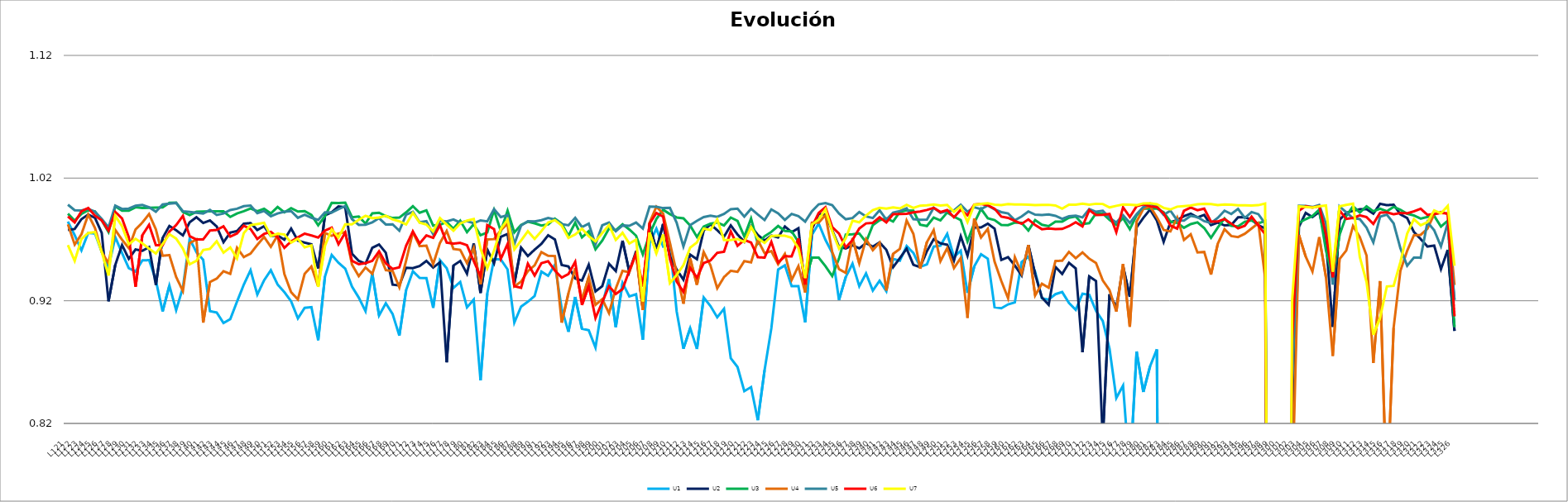
| Category | U1 | U2 | U3 | U4 | U5 | U6 | U7 |
|---|---|---|---|---|---|---|---|
| L121 | 0.984 | 0.978 | 0.991 | 0.982 | 0.998 | 0.989 | 0.965 |
| L122 | 0.973 | 0.978 | 0.985 | 0.966 | 0.994 | 0.984 | 0.952 |
| L123 | 0.961 | 0.987 | 0.991 | 0.974 | 0.994 | 0.993 | 0.97 |
| L124 | 0.975 | 0.99 | 0.994 | 0.99 | 0.995 | 0.996 | 0.975 |
| L125 | 0.975 | 0.988 | 0.993 | 0.979 | 0.993 | 0.989 | 0.976 |
| L126 | 0.96 | 0.975 | 0.985 | 0.96 | 0.987 | 0.986 | 0.96 |
| L127 | 0.947 | 0.92 | 0.976 | 0.951 | 0.98 | 0.977 | 0.941 |
| L128 | 0.972 | 0.949 | 0.997 | 0.978 | 0.998 | 0.992 | 0.989 |
| L129 | 0.959 | 0.965 | 0.993 | 0.97 | 0.995 | 0.987 | 0.981 |
| L130 | 0.947 | 0.954 | 0.993 | 0.963 | 0.995 | 0.972 | 0.966 |
| L131 | 0.944 | 0.962 | 0.996 | 0.978 | 0.997 | 0.931 | 0.97 |
| L132 | 0.953 | 0.961 | 0.996 | 0.984 | 0.998 | 0.973 | 0.967 |
| L133 | 0.953 | 0.964 | 0.996 | 0.991 | 0.996 | 0.982 | 0.962 |
| L134 | 0.937 | 0.933 | 0.996 | 0.978 | 0.993 | 0.965 | 0.959 |
| L135 | 0.911 | 0.971 | 0.996 | 0.957 | 0.998 | 0.965 | 0.966 |
| L136 | 0.932 | 0.981 | 1 | 0.957 | 0.999 | 0.976 | 0.974 |
| L137 | 0.912 | 0.977 | 1 | 0.939 | 1 | 0.982 | 0.971 |
| L138 | 0.931 | 0.973 | 0.992 | 0.928 | 0.993 | 0.989 | 0.963 |
| L139 | 0.97 | 0.984 | 0.99 | 0.967 | 0.992 | 0.973 | 0.95 |
| L140 | 0.96 | 0.988 | 0.993 | 0.97 | 0.992 | 0.97 | 0.953 |
| L141 | 0.953 | 0.983 | 0.993 | 0.902 | 0.991 | 0.97 | 0.961 |
| L142 | 0.912 | 0.985 | 0.993 | 0.935 | 0.994 | 0.977 | 0.962 |
| L143 | 0.91 | 0.981 | 0.993 | 0.938 | 0.99 | 0.978 | 0.969 |
| L144 | 0.902 | 0.968 | 0.993 | 0.944 | 0.991 | 0.981 | 0.959 |
| L145 | 0.905 | 0.976 | 0.988 | 0.942 | 0.994 | 0.972 | 0.963 |
| L146 | 0.919 | 0.977 | 0.991 | 0.963 | 0.995 | 0.975 | 0.954 |
| L147 | 0.933 | 0.983 | 0.993 | 0.956 | 0.997 | 0.981 | 0.975 |
| L148 | 0.945 | 0.983 | 0.995 | 0.958 | 0.998 | 0.978 | 0.982 |
| L149 | 0.925 | 0.978 | 0.993 | 0.966 | 0.991 | 0.97 | 0.983 |
| L150 | 0.937 | 0.981 | 0.995 | 0.972 | 0.993 | 0.975 | 0.984 |
| L151 | 0.945 | 0.973 | 0.991 | 0.964 | 0.989 | 0.976 | 0.973 |
| L152 | 0.933 | 0.973 | 0.996 | 0.973 | 0.991 | 0.972 | 0.975 |
| L153 | 0.927 | 0.97 | 0.992 | 0.942 | 0.993 | 0.963 | 0.974 |
| L154 | 0.92 | 0.979 | 0.996 | 0.927 | 0.993 | 0.968 | 0.967 |
| L155 | 0.906 | 0.969 | 0.993 | 0.921 | 0.988 | 0.972 | 0.97 |
| L156 | 0.914 | 0.967 | 0.993 | 0.942 | 0.99 | 0.975 | 0.964 |
| L157 | 0.915 | 0.966 | 0.99 | 0.948 | 0.988 | 0.973 | 0.965 |
| L158 | 0.888 | 0.946 | 0.982 | 0.932 | 0.986 | 0.972 | 0.931 |
| L159 | 0.94 | 0.99 | 0.989 | 0.975 | 0.992 | 0.977 | 0.965 |
| L160 | 0.957 | 0.992 | 1 | 0.973 | 0.992 | 0.98 | 0.978 |
| L161 | 0.951 | 0.997 | 1 | 0.975 | 0.995 | 0.966 | 0.972 |
| L162 | 0.946 | 0.996 | 1 | 0.976 | 0.997 | 0.976 | 0.982 |
| L163 | 0.932 | 0.958 | 0.988 | 0.95 | 0.987 | 0.953 | 0.982 |
| L164 | 0.923 | 0.952 | 0.989 | 0.94 | 0.982 | 0.95 | 0.986 |
| L165 | 0.911 | 0.95 | 0.983 | 0.947 | 0.982 | 0.951 | 0.989 |
| L166 | 0.942 | 0.963 | 0.991 | 0.942 | 0.984 | 0.953 | 0.987 |
| L167 | 0.908 | 0.966 | 0.992 | 0.958 | 0.987 | 0.96 | 0.988 |
| L168 | 0.918 | 0.959 | 0.989 | 0.945 | 0.982 | 0.951 | 0.989 |
| L169 | 0.909 | 0.933 | 0.987 | 0.944 | 0.982 | 0.946 | 0.986 |
| L170 | 0.892 | 0.932 | 0.988 | 0.931 | 0.977 | 0.947 | 0.985 |
| L171 | 0.929 | 0.947 | 0.992 | 0.953 | 0.99 | 0.965 | 0.982 |
| L172 | 0.944 | 0.947 | 0.997 | 0.976 | 0.993 | 0.977 | 0.992 |
| L173 | 0.939 | 0.948 | 0.992 | 0.965 | 0.984 | 0.967 | 0.984 |
| L174 | 0.938 | 0.952 | 0.994 | 0.965 | 0.985 | 0.973 | 0.982 |
| L175 | 0.914 | 0.947 | 0.981 | 0.95 | 0.974 | 0.971 | 0.977 |
| L176 | 0.953 | 0.951 | 0.982 | 0.967 | 0.985 | 0.982 | 0.987 |
| L177 | 0.947 | 0.87 | 0.984 | 0.977 | 0.985 | 0.967 | 0.982 |
| L178 | 0.931 | 0.949 | 0.979 | 0.962 | 0.986 | 0.967 | 0.977 |
| L179 | 0.935 | 0.952 | 0.985 | 0.961 | 0.984 | 0.967 | 0.983 |
| L180 | 0.915 | 0.942 | 0.976 | 0.951 | 0.985 | 0.965 | 0.985 |
| L181 | 0.921 | 0.967 | 0.982 | 0.963 | 0.983 | 0.952 | 0.987 |
| L182 | 0.855 | 0.926 | 0.973 | 0.933 | 0.986 | 0.94 | 0.963 |
| L183 | 0.926 | 0.962 | 0.976 | 0.97 | 0.985 | 0.982 | 0.946 |
| L184 | 0.954 | 0.951 | 0.994 | 0.97 | 0.995 | 0.978 | 0.961 |
| L185 | 0.954 | 0.972 | 0.977 | 0.978 | 0.988 | 0.954 | 0.979 |
| L186 | 0.946 | 0.974 | 0.993 | 0.983 | 0.99 | 0.966 | 0.986 |
| L187 | 0.902 | 0.934 | 0.976 | 0.932 | 0.966 | 0.932 | 0.962 |
| L188 | 0.915 | 0.963 | 0.982 | 0.936 | 0.981 | 0.931 | 0.969 |
| L189 | 0.919 | 0.956 | 0.984 | 0.944 | 0.985 | 0.95 | 0.977 |
| L190 | 0.924 | 0.962 | 0.983 | 0.949 | 0.985 | 0.941 | 0.97 |
| L191 | 0.944 | 0.966 | 0.981 | 0.96 | 0.986 | 0.951 | 0.977 |
| L192 | 0.94 | 0.973 | 0.982 | 0.957 | 0.987 | 0.952 | 0.984 |
| L193 | 0.949 | 0.97 | 0.987 | 0.956 | 0.986 | 0.945 | 0.986 |
| L194 | 0.914 | 0.949 | 0.983 | 0.902 | 0.983 | 0.939 | 0.981 |
| L195 | 0.895 | 0.948 | 0.973 | 0.926 | 0.982 | 0.942 | 0.971 |
| L196 | 0.923 | 0.938 | 0.984 | 0.947 | 0.988 | 0.952 | 0.974 |
| L197 | 0.897 | 0.936 | 0.972 | 0.921 | 0.98 | 0.917 | 0.979 |
| L198 | 0.896 | 0.949 | 0.977 | 0.939 | 0.983 | 0.932 | 0.973 |
| L199 | 0.882 | 0.928 | 0.962 | 0.917 | 0.966 | 0.906 | 0.968 |
| L200 | 0.917 | 0.932 | 0.969 | 0.921 | 0.981 | 0.919 | 0.975 |
| L201 | 0.938 | 0.95 | 0.979 | 0.91 | 0.984 | 0.932 | 0.982 |
| L202 | 0.899 | 0.944 | 0.977 | 0.93 | 0.977 | 0.926 | 0.97 |
| L203 | 0.934 | 0.969 | 0.982 | 0.944 | 0.981 | 0.93 | 0.975 |
| L204 | 0.923 | 0.944 | 0.978 | 0.943 | 0.981 | 0.944 | 0.967 |
| L205 | 0.925 | 0.96 | 0.973 | 0.958 | 0.984 | 0.959 | 0.97 |
| L206 | 0.888 | 0.913 | 0.958 | 0.912 | 0.979 | 0.932 | 0.919 |
| L207 | 0.967 | 0.982 | 0.974 | 0.984 | 0.997 | 0.983 | 0.976 |
| L208 | 0.979 | 0.961 | 0.987 | 0.997 | 0.997 | 0.992 | 0.959 |
| L209 | 0.964 | 0.983 | 0.994 | 0.991 | 0.996 | 0.989 | 0.974 |
| L210 | 0.967 | 0.956 | 0.991 | 0.967 | 0.996 | 0.954 | 0.934 |
| L211 | 0.911 | 0.945 | 0.988 | 0.943 | 0.984 | 0.936 | 0.941 |
| L212 | 0.881 | 0.937 | 0.987 | 0.918 | 0.964 | 0.927 | 0.949 |
| L213 | 0.898 | 0.958 | 0.981 | 0.954 | 0.982 | 0.947 | 0.963 |
| L214 | 0.881 | 0.954 | 0.972 | 0.933 | 0.985 | 0.939 | 0.968 |
| L215 | 0.923 | 0.977 | 0.981 | 0.96 | 0.988 | 0.951 | 0.979 |
| L216 | 0.916 | 0.982 | 0.983 | 0.949 | 0.989 | 0.953 | 0.978 |
| L217 | 0.907 | 0.978 | 0.984 | 0.93 | 0.988 | 0.959 | 0.986 |
| L218 | 0.913 | 0.972 | 0.981 | 0.939 | 0.991 | 0.96 | 0.969 |
| L219 | 0.873 | 0.981 | 0.988 | 0.944 | 0.995 | 0.977 | 0.97 |
| L220 | 0.866 | 0.974 | 0.985 | 0.944 | 0.995 | 0.965 | 0.97 |
| L221 | 0.846 | 0.968 | 0.972 | 0.952 | 0.989 | 0.97 | 0.968 |
| L222 | 0.85 | 0.981 | 0.987 | 0.951 | 0.995 | 0.967 | 0.98 |
| L223 | 0.823 | 0.974 | 0.967 | 0.969 | 0.99 | 0.955 | 0.971 |
| L224 | 0.863 | 0.969 | 0.973 | 0.959 | 0.986 | 0.955 | 0.967 |
| L225 | 0.898 | 0.973 | 0.976 | 0.96 | 0.994 | 0.968 | 0.973 |
| L226 | 0.945 | 0.972 | 0.981 | 0.95 | 0.991 | 0.951 | 0.973 |
| L227 | 0.949 | 0.981 | 0.977 | 0.958 | 0.986 | 0.956 | 0.973 |
| L228 | 0.932 | 0.976 | 0.977 | 0.937 | 0.991 | 0.956 | 0.971 |
| L229 | 0.932 | 0.979 | 0.968 | 0.948 | 0.989 | 0.971 | 0.963 |
| L230 | 0.902 | 0.929 | 0.937 | 0.927 | 0.985 | 0.933 | 0.938 |
| L231 | 0.974 | 0.978 | 0.955 | 0.984 | 0.993 | 0.98 | 0.982 |
| L232 | 0.983 | 0.991 | 0.955 | 0.984 | 0.999 | 0.992 | 0.986 |
| L233 | 0.97 | 0.99 | 0.948 | 0.99 | 1 | 0.996 | 0.995 |
| L234 | 0.959 | 0.977 | 0.94 | 0.96 | 0.998 | 0.98 | 0.977 |
| L235 | 0.921 | 0.964 | 0.954 | 0.946 | 0.991 | 0.975 | 0.963 |
| L236 | 0.939 | 0.963 | 0.974 | 0.943 | 0.986 | 0.963 | 0.971 |
| L237 | 0.95 | 0.965 | 0.974 | 0.971 | 0.987 | 0.97 | 0.985 |
| L238 | 0.932 | 0.963 | 0.975 | 0.951 | 0.992 | 0.979 | 0.984 |
| L239 | 0.942 | 0.967 | 0.968 | 0.97 | 0.989 | 0.983 | 0.989 |
| L240 | 0.928 | 0.964 | 0.982 | 0.961 | 0.987 | 0.984 | 0.994 |
| L241 | 0.936 | 0.968 | 0.986 | 0.967 | 0.994 | 0.988 | 0.996 |
| L242 | 0.928 | 0.962 | 0.987 | 0.928 | 0.986 | 0.984 | 0.995 |
| L243 | 0.954 | 0.947 | 0.985 | 0.958 | 0.992 | 0.991 | 0.996 |
| L244 | 0.953 | 0.955 | 0.992 | 0.962 | 0.993 | 0.991 | 0.995 |
| L245 | 0.965 | 0.962 | 0.994 | 0.985 | 0.995 | 0.991 | 0.998 |
| L246 | 0.959 | 0.949 | 0.993 | 0.974 | 0.987 | 0.992 | 0.996 |
| L247 | 0.948 | 0.947 | 0.982 | 0.946 | 0.986 | 0.993 | 0.998 |
| L248 | 0.95 | 0.96 | 0.981 | 0.968 | 0.986 | 0.994 | 0.998 |
| L249 | 0.964 | 0.97 | 0.988 | 0.978 | 0.996 | 0.996 | 0.998 |
| L250 | 0.965 | 0.967 | 0.985 | 0.952 | 0.992 | 0.992 | 0.998 |
| L251 | 0.975 | 0.966 | 0.992 | 0.963 | 0.993 | 0.994 | 0.998 |
| L252 | 0.956 | 0.953 | 0.989 | 0.947 | 0.994 | 0.988 | 0.992 |
| L253 | 0.961 | 0.973 | 0.986 | 0.955 | 0.998 | 0.994 | 0.997 |
| L254 | 0.926 | 0.957 | 0.968 | 0.906 | 0.993 | 0.99 | 0.984 |
| L255 | 0.948 | 0.98 | 0.983 | 0.987 | 0.996 | 0.998 | 0.998 |
| L256 | 0.958 | 0.98 | 0.995 | 0.972 | 0.995 | 0.999 | 0.999 |
| L257 | 0.954 | 0.983 | 0.987 | 0.979 | 0.998 | 0.998 | 1 |
| L258 | 0.915 | 0.979 | 0.986 | 0.952 | 0.994 | 0.995 | 0.998 |
| L259 | 0.914 | 0.953 | 0.982 | 0.936 | 0.992 | 0.989 | 0.998 |
| L260 | 0.917 | 0.956 | 0.982 | 0.922 | 0.991 | 0.988 | 0.999 |
| L261 | 0.919 | 0.949 | 0.984 | 0.956 | 0.986 | 0.985 | 0.998 |
| L262 | 0.952 | 0.941 | 0.983 | 0.942 | 0.989 | 0.983 | 0.999 |
| L263 | 0.956 | 0.965 | 0.977 | 0.965 | 0.993 | 0.986 | 0.998 |
| L264 | 0.944 | 0.942 | 0.986 | 0.924 | 0.99 | 0.982 | 0.998 |
| L265 | 0.922 | 0.923 | 0.982 | 0.934 | 0.99 | 0.978 | 0.998 |
| L266 | 0.921 | 0.917 | 0.981 | 0.931 | 0.99 | 0.979 | 0.998 |
| L267 | 0.925 | 0.948 | 0.984 | 0.952 | 0.989 | 0.978 | 0.998 |
| L268 | 0.927 | 0.942 | 0.985 | 0.953 | 0.987 | 0.979 | 0.995 |
| L269 | 0.918 | 0.951 | 0.988 | 0.96 | 0.989 | 0.981 | 0.998 |
| L270 | 0.913 | 0.946 | 0.989 | 0.955 | 0.989 | 0.984 | 0.998 |
| L271 | 0.926 | 0.878 | 0.983 | 0.959 | 0.988 | 0.981 | 0.999 |
| L272 | 0.925 | 0.94 | 0.983 | 0.954 | 0.995 | 0.994 | 0.998 |
| L273 | 0.912 | 0.936 | 0.991 | 0.951 | 0.993 | 0.99 | 0.999 |
| L274 | 0.903 | 0.807 | 0.991 | 0.937 | 0.993 | 0.99 | 0.999 |
| L275 | 0.881 | 0.925 | 0.986 | 0.929 | 0.988 | 0.991 | 0.996 |
| L276 | 0.841 | 0.914 | 0.982 | 0.911 | 0.984 | 0.976 | 0.997 |
| L277 | 0.851 | 0.948 | 0.987 | 0.95 | 0.99 | 0.996 | 0.998 |
| L278 | 0.778 | 0.923 | 0.978 | 0.899 | 0.983 | 0.988 | 0.998 |
| L279 | 0.879 | 0.98 | 0.99 | 0.985 | 0.991 | 0.997 | 0.998 |
| L280 | 0.846 | 0.988 | 0.995 | 0.995 | 0.996 | 0.999 | 0.999 |
| L281 | 0.867 | 0.994 | 0.995 | 0.997 | 0.999 | 0.997 | 0.999 |
| L282 | 0.88 | 0.985 | 0.995 | 0.988 | 0.997 | 0.996 | 0.999 |
| L283 | 0 | 0.968 | 0.992 | 0.978 | 0.99 | 0.991 | 0.996 |
| L284 | 0 | 0.984 | 0.985 | 0.976 | 0.993 | 0.981 | 0.994 |
| L285 | 0 | 0.986 | 0.984 | 0.988 | 0.986 | 0.979 | 0.997 |
| L286 | 0 | 0.989 | 0.98 | 0.97 | 0.985 | 0.993 | 0.997 |
| L287 | 0 | 0.991 | 0.982 | 0.974 | 0.989 | 0.996 | 0.998 |
| L288 | 0 | 0.988 | 0.984 | 0.959 | 0.988 | 0.994 | 0.999 |
| L289 | 0 | 0.99 | 0.979 | 0.96 | 0.985 | 0.995 | 0.999 |
| L290 | 0 | 0.982 | 0.971 | 0.941 | 0.983 | 0.985 | 0.999 |
| L291 | 0 | 0.984 | 0.98 | 0.966 | 0.988 | 0.985 | 0.998 |
| L292 | 0 | 0.981 | 0.987 | 0.978 | 0.993 | 0.987 | 0.998 |
| L293 | 0 | 0.982 | 0.981 | 0.973 | 0.991 | 0.983 | 0.998 |
| L294 | 0 | 0.988 | 0.981 | 0.972 | 0.995 | 0.979 | 0.998 |
| L295 | 0 | 0.988 | 0.984 | 0.975 | 0.988 | 0.981 | 0.998 |
| L296 | 0 | 0.986 | 0.985 | 0.979 | 0.992 | 0.988 | 0.998 |
| L297 | 0 | 0.982 | 0.983 | 0.983 | 0.991 | 0.981 | 0.998 |
| L298 | 0 | 0.979 | 0.985 | 0.939 | 0.983 | 0.974 | 0.999 |
| L299 | 0 | 0 | 0 | 0 | 0 | 0 | 0 |
| L300 | 0 | 0 | 0 | 0 | 0 | 0 | 0 |
| L301 | 0 | 0 | 0 | 0 | 0 | 0 | 0 |
| L302 | 0 | 0.787 | 0.862 | 0.76 | 0.856 | 0.887 | 0.921 |
| L303 | 0 | 0.98 | 0.983 | 0.974 | 0.997 | 0.993 | 0.997 |
| L304 | 0 | 0.992 | 0.986 | 0.956 | 0.997 | 0.997 | 0.997 |
| L305 | 0 | 0.988 | 0.989 | 0.944 | 0.996 | 0.996 | 0.996 |
| L306 | 0 | 0.992 | 0.994 | 0.972 | 0.998 | 0.997 | 0.997 |
| L307 | 0 | 0.969 | 0.961 | 0.939 | 0.983 | 0.974 | 0.998 |
| L308 | 0 | 0.899 | 0.938 | 0.875 | 0.933 | 0.939 | 0.944 |
| L309 | 0 | 0.986 | 0.974 | 0.954 | 0.997 | 0.994 | 0.997 |
| L310 | 0 | 0.992 | 0.989 | 0.961 | 0.992 | 0.987 | 0.998 |
| L311 | 0 | 0.993 | 0.997 | 0.981 | 0.987 | 0.988 | 0.999 |
| L312 | 0 | 0.995 | 0.992 | 0.972 | 0.987 | 0.99 | 0.956 |
| L313 | 0 | 0.995 | 0.997 | 0.957 | 0.98 | 0.988 | 0.935 |
| L314 | 0 | 0.991 | 0.993 | 0.869 | 0.968 | 0.983 | 0.892 |
| L315 | 0 | 0.999 | 0.995 | 0.936 | 0.989 | 0.992 | 0.906 |
| L316 | 0 | 0.998 | 0.993 | 0.756 | 0.99 | 0.992 | 0.932 |
| L317 | 0 | 0.998 | 0.997 | 0.898 | 0.983 | 0.991 | 0.932 |
| L318 | 0 | 0.99 | 0.994 | 0.944 | 0.963 | 0.992 | 0.952 |
| L319 | 0 | 0.987 | 0.991 | 0.961 | 0.949 | 0.991 | 0.975 |
| L320 | 0 | 0.976 | 0.99 | 0.973 | 0.955 | 0.993 | 0.986 |
| L321 | 0 | 0.97 | 0.987 | 0.974 | 0.955 | 0.995 | 0.982 |
| L322 | 0 | 0.964 | 0.988 | 0.979 | 0.984 | 0.99 | 0.984 |
| L323 | 0 | 0.965 | 0.989 | 0.99 | 0.977 | 0.991 | 0.994 |
| L324 | 0 | 0.946 | 0.98 | 0.992 | 0.964 | 0.992 | 0.991 |
| L325 | 0 | 0.962 | 0.985 | 0.991 | 0.983 | 0.991 | 0.997 |
| L326 | 0 | 0.895 | 0.898 | 0.933 | 0.921 | 0.907 | 0.948 |